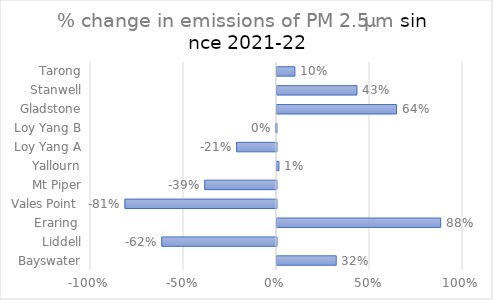
| Category | PM 2.5μm |
|---|---|
| Bayswater | 0.319 |
| Liddell | -0.617 |
|  Eraring  | 0.88 |
| Vales Point  | -0.815 |
| Mt Piper | -0.386 |
| Yallourn | 0.01 |
| Loy Yang A | -0.214 |
| Loy Yang B | -0.004 |
| Gladstone | 0.643 |
| Stanwell | 0.43 |
| Tarong | 0.096 |